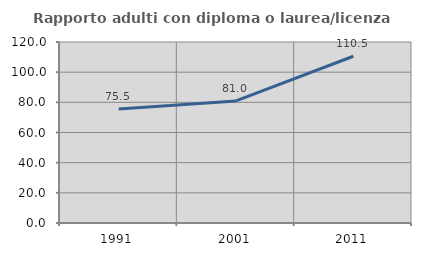
| Category | Rapporto adulti con diploma o laurea/licenza media  |
|---|---|
| 1991.0 | 75.51 |
| 2001.0 | 80.958 |
| 2011.0 | 110.549 |